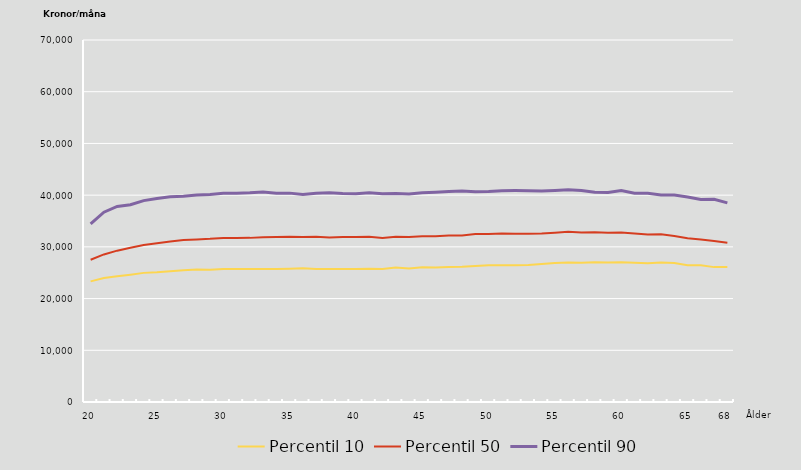
| Category | Percentil 10 | Percentil 50 | Percentil 90 |
|---|---|---|---|
| 20.0 | 23326 | 27501 | 34439 |
| nan | 23970 | 28536 | 36708 |
| nan | 24314 | 29266 | 37824 |
| nan | 24629 | 29830 | 38139 |
| nan | 24969 | 30377 | 38941 |
| 25.0 | 25086 | 30696 | 39367 |
| nan | 25293 | 31023 | 39672 |
| nan | 25500 | 31315 | 39780 |
| nan | 25601 | 31446 | 40020 |
| nan | 25581 | 31555 | 40134 |
| 30.0 | 25715 | 31734 | 40357 |
| nan | 25708 | 31723 | 40359 |
| nan | 25724 | 31737 | 40446 |
| nan | 25742 | 31842 | 40624 |
| nan | 25714 | 31927 | 40388 |
| 35.0 | 25778 | 31956 | 40390 |
| nan | 25840 | 31925 | 40135 |
| nan | 25704 | 31943 | 40386 |
| nan | 25714 | 31799 | 40460 |
| nan | 25703 | 31901 | 40324 |
| 40.0 | 25725 | 31926 | 40261 |
| nan | 25787 | 31947 | 40461 |
| nan | 25703 | 31728 | 40251 |
| nan | 25996 | 31973 | 40338 |
| nan | 25797 | 31898 | 40211 |
| 45.0 | 26066 | 32039 | 40464 |
| nan | 26016 | 32070 | 40573 |
| nan | 26102 | 32209 | 40682 |
| nan | 26168 | 32197 | 40813 |
| nan | 26310 | 32490 | 40663 |
| 50.0 | 26449 | 32510 | 40709 |
| nan | 26460 | 32600 | 40870 |
| nan | 26449 | 32527 | 40874 |
| nan | 26479 | 32538 | 40871 |
| nan | 26700 | 32588 | 40778 |
| 55.0 | 26877 | 32748 | 40890 |
| nan | 26963 | 32932 | 41049 |
| nan | 26949 | 32785 | 40908 |
| nan | 27043 | 32815 | 40555 |
| nan | 26957 | 32717 | 40506 |
| 60.0 | 27000 | 32793 | 40908 |
| nan | 26904 | 32598 | 40368 |
| nan | 26808 | 32404 | 40348 |
| nan | 26970 | 32425 | 40017 |
| nan | 26861 | 32110 | 40020 |
| 65.0 | 26449 | 31648 | 39651 |
| nan | 26448 | 31435 | 39150 |
| nan | 26082 | 31112 | 39184 |
| 68.0 | 26100 | 30801 | 38496 |